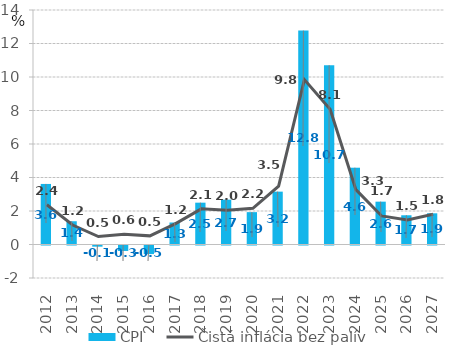
| Category | CPI |
|---|---|
| 2012.0 | 3.615 |
| 2013.0 | 1.389 |
| 2014.0 | -0.069 |
| 2015.0 | -0.326 |
| 2016.0 | -0.514 |
| 2017.0 | 1.313 |
| 2018.0 | 2.497 |
| 2019.0 | 2.677 |
| 2020.0 | 1.932 |
| 2021.0 | 3.156 |
| 2022.0 | 12.769 |
| 2023.0 | 10.701 |
| 2024.0 | 4.584 |
| 2025.0 | 2.557 |
| 2026.0 | 1.745 |
| 2027.0 | 1.863 |